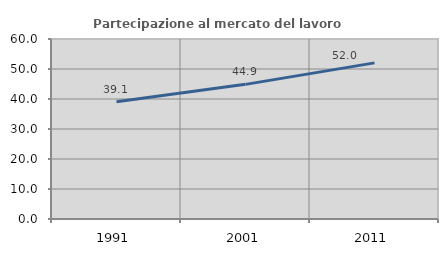
| Category | Partecipazione al mercato del lavoro  femminile |
|---|---|
| 1991.0 | 39.062 |
| 2001.0 | 44.88 |
| 2011.0 | 52.045 |